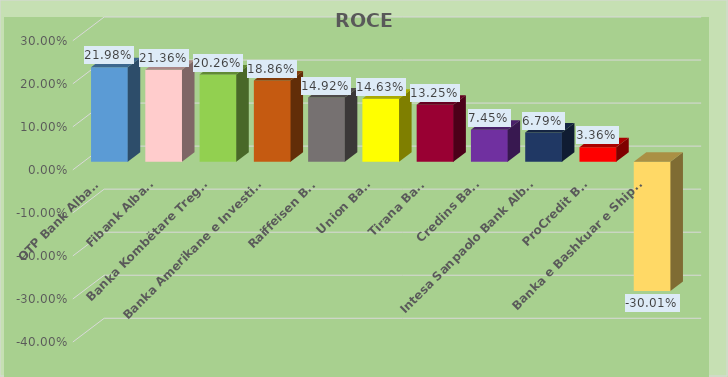
| Category | ROCE |
|---|---|
| OTP Bank Albania | 0.22 |
| Fibank Albania | 0.214 |
| Banka Kombëtare Tregtare | 0.203 |
| Banka Amerikane e Investimeve | 0.189 |
| Raiffeisen Bank | 0.149 |
| Union Bank  | 0.146 |
| Tirana Bank | 0.132 |
| Credins Bank | 0.075 |
| Intesa Sanpaolo Bank Albania | 0.068 |
| ProCredit Bank | 0.034 |
| Banka e Bashkuar e Shipërisë | -0.3 |